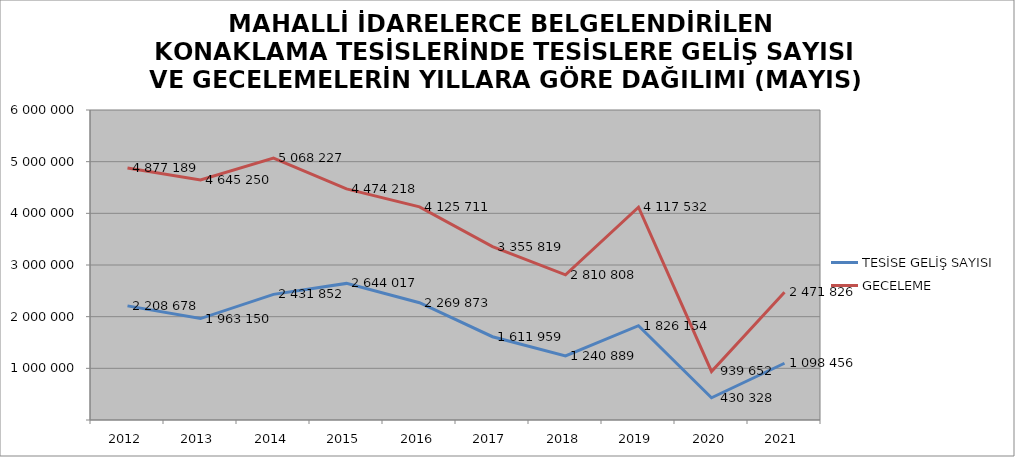
| Category | TESİSE GELİŞ SAYISI | GECELEME |
|---|---|---|
| 2012 | 2208678 | 4877189 |
| 2013 | 1963150 | 4645250 |
| 2014 | 2431852 | 5068227 |
| 2015 | 2644017 | 4474218 |
| 2016 | 2269873 | 4125711 |
| 2017 | 1611959 | 3355819 |
| 2018 | 1240889 | 2810808 |
| 2019 | 1826154 | 4117532 |
| 2020 | 430328 | 939652 |
| 2021 | 1098456 | 2471826 |